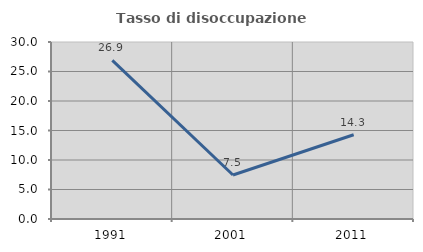
| Category | Tasso di disoccupazione giovanile  |
|---|---|
| 1991.0 | 26.891 |
| 2001.0 | 7.463 |
| 2011.0 | 14.286 |